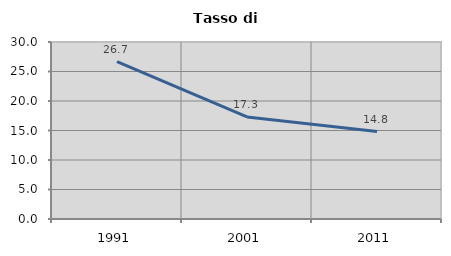
| Category | Tasso di disoccupazione   |
|---|---|
| 1991.0 | 26.655 |
| 2001.0 | 17.295 |
| 2011.0 | 14.819 |